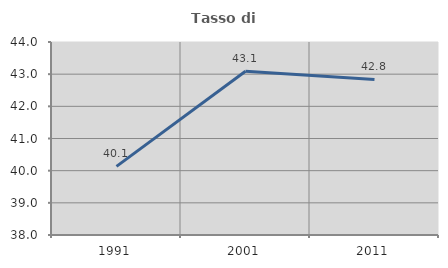
| Category | Tasso di occupazione   |
|---|---|
| 1991.0 | 40.132 |
| 2001.0 | 43.089 |
| 2011.0 | 42.835 |